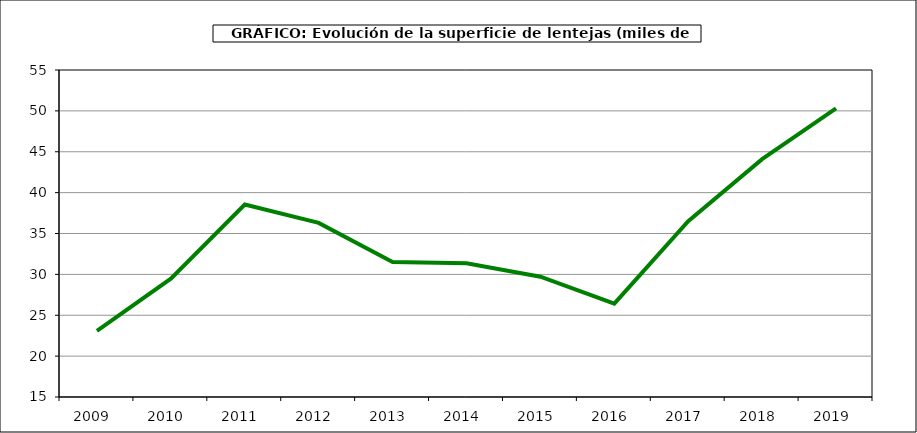
| Category | Superficie |
|---|---|
| 2009.0 | 23.088 |
| 2010.0 | 29.478 |
| 2011.0 | 38.55 |
| 2012.0 | 36.298 |
| 2013.0 | 31.506 |
| 2014.0 | 31.35 |
| 2015.0 | 29.72 |
| 2016.0 | 26.427 |
| 2017.0 | 36.504 |
| 2018.0 | 44.101 |
| 2019.0 | 50.318 |